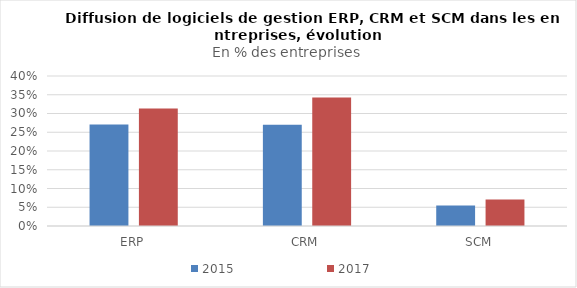
| Category | 2015 | 2017 |
|---|---|---|
| ERP | 0.271 | 0.313 |
| CRM | 0.27 | 0.343 |
| SCM | 0.055 | 0.07 |